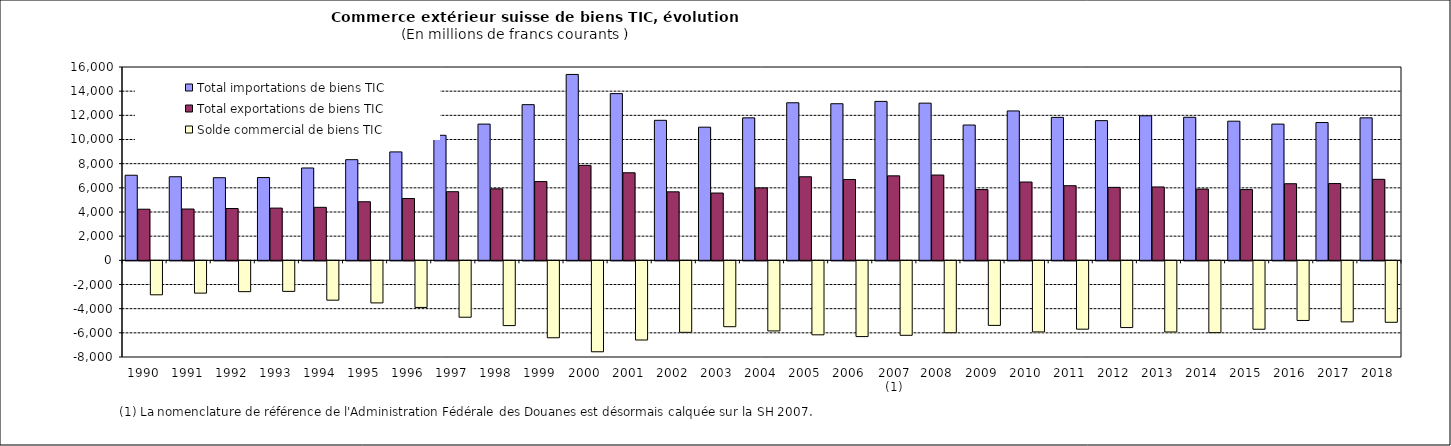
| Category | Total importations de biens TIC | Total exportations de biens TIC | Solde commercial de biens TIC |
|---|---|---|---|
| 1990 | 7043.215 | 4231.191 | -2812.025 |
| 1991 | 6918.332 | 4246.634 | -2671.698 |
| 1992 | 6838.565 | 4288.681 | -2549.884 |
| 1993 | 6851.701 | 4323.053 | -2528.648 |
| 1994 | 7642.126 | 4387.76 | -3254.366 |
| 1995 | 8330.021 | 4847.542 | -3482.479 |
| 1996 | 8972.833 | 5116.856 | -3855.977 |
| 1997 | 10347.863 | 5680.291 | -4667.572 |
| 1998 | 11273.785 | 5913.959 | -5359.826 |
| 1999 | 12883.689 | 6518.032 | -6365.657 |
| 2000 | 15383.908 | 7857.447 | -7526.461 |
| 2001 | 13799.08 | 7246.555 | -6552.524 |
| 2002 | 11586.772 | 5669.087 | -5917.685 |
| 2003 | 11019.238 | 5568.629 | -5450.609 |
| 2004 | 11793.307 | 5992.472 | -5800.835 |
| 2005 | 13038.922 | 6915.251 | -6123.671 |
| 2006 | 12959.973 | 6690.613 | -6269.36 |
| 2007 (1) | 13153.755 | 6991.103 | -6162.652 |
| 2008 | 13008.083 | 7058.679 | -5949.405 |
| 2009 | 11198.456 | 5854.826 | -5343.63 |
| 2010 | 12364.801 | 6480.846 | -5883.955 |
| 2011 | 11831.733 | 6176.012 | -5655.721 |
| 2012 | 11561.378 | 6037.969 | -5523.409 |
| 2013 | 11962.779 | 6073.654 | -5889.124 |
| 2014 | 11838.141 | 5896.203 | -5941.938 |
| 2015 | 11514.94 | 5854.068 | -5660.872 |
| 2016 | 11273.944 | 6339.533 | -4934.411 |
| 2017 | 11404.313 | 6353.539 | -5050.773 |
| 2018 | 11791.067 | 6704.772 | -5086.295 |